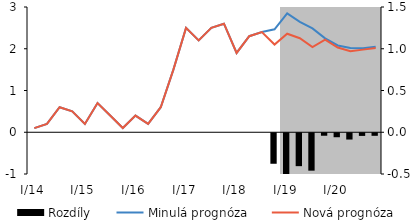
| Category | Rozdíly |
|---|---|
| I/14 | 0 |
| II | 0 |
| III | 0 |
| IV | 0 |
| I/15 | 0 |
| II | 0 |
| III | 0 |
| IV | 0 |
| I/16 | 0 |
| II | 0 |
| III | 0 |
| IV | 0 |
| I/17 | 0 |
| II | 0 |
| III | 0 |
| IV | 0 |
| I/18 | 0 |
| II | 0 |
| III | 0 |
| IV | -0.365 |
| I/19 | -0.488 |
| II | -0.394 |
| III | -0.448 |
| IV | -0.03 |
| I/20 | -0.048 |
| II | -0.075 |
| III | -0.032 |
| IV | -0.031 |